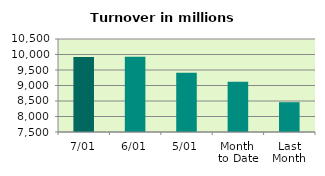
| Category | Series 0 |
|---|---|
| 7/01 | 9918.646 |
| 6/01 | 9928.835 |
| 5/01 | 9410.401 |
| Month 
to Date | 9123.298 |
| Last
Month | 8461.957 |